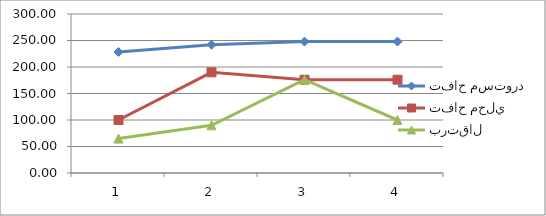
| Category | تفاح مستورد | تفاح محلي | برتقال |
|---|---|---|---|
| 0 | 228.33 | 100 | 65 |
| 1 | 242 | 190 | 90 |
| 2 | 248 | 176 | 176 |
| 3 | 248 | 176 | 100 |